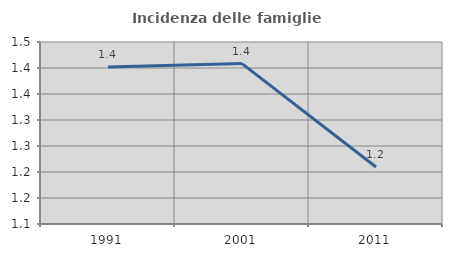
| Category | Incidenza delle famiglie numerose |
|---|---|
| 1991.0 | 1.402 |
| 2001.0 | 1.408 |
| 2011.0 | 1.21 |